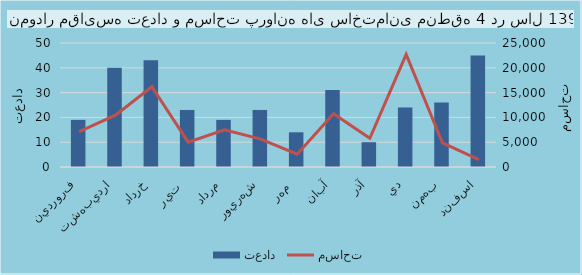
| Category | تعداد |
|---|---|
| فروردين | 19 |
| ارديبهشت | 40 |
| خرداد | 43 |
| تير  | 23 |
| مرداد | 19 |
| شهريور | 23 |
| مهر  | 14 |
| آبان | 31 |
| آذر | 10 |
| دي | 24 |
| بهمن | 26 |
| اسفند | 45 |